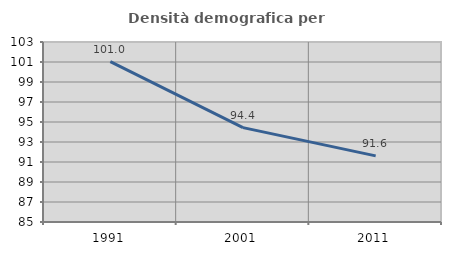
| Category | Densità demografica |
|---|---|
| 1991.0 | 101.034 |
| 2001.0 | 94.441 |
| 2011.0 | 91.615 |